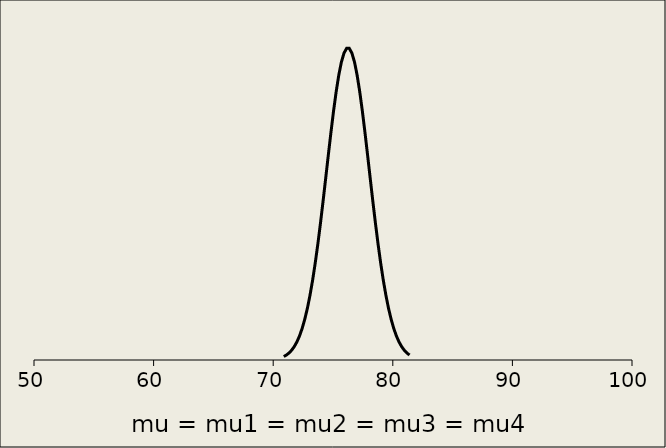
| Category | All conditions |
|---|---|
| 70.88343685400051 | 0.002 |
| 71.10248024771477 | 0.004 |
| 71.32152364142902 | 0.005 |
| 71.54056703514328 | 0.007 |
| 71.75961042885754 | 0.01 |
| 71.97865382257181 | 0.013 |
| 72.19769721628607 | 0.017 |
| 72.41674061000033 | 0.022 |
| 72.63578400371459 | 0.029 |
| 72.85482739742885 | 0.037 |
| 73.07387079114311 | 0.046 |
| 73.29291418485737 | 0.057 |
| 73.51195757857164 | 0.069 |
| 73.7310009722859 | 0.083 |
| 73.95004436600016 | 0.098 |
| 74.16908775971442 | 0.113 |
| 74.38813115342867 | 0.13 |
| 74.60717454714293 | 0.146 |
| 74.8262179408572 | 0.162 |
| 75.04526133457145 | 0.178 |
| 75.2643047282857 | 0.192 |
| 75.48334812199997 | 0.203 |
| 75.70239151571423 | 0.213 |
| 75.92143490942848 | 0.219 |
| 76.14047830314274 | 0.223 |
| 76.359521696857 | 0.223 |
| 76.57856509057126 | 0.219 |
| 76.7976084842855 | 0.213 |
| 77.01665187799978 | 0.203 |
| 77.23569527171404 | 0.192 |
| 77.4547386654283 | 0.178 |
| 77.67378205914255 | 0.162 |
| 77.89282545285681 | 0.146 |
| 78.11186884657107 | 0.13 |
| 78.33091224028533 | 0.113 |
| 78.54995563399957 | 0.098 |
| 78.76899902771385 | 0.083 |
| 78.9880424214281 | 0.069 |
| 79.20708581514236 | 0.057 |
| 79.42612920885662 | 0.046 |
| 79.64517260257088 | 0.037 |
| 79.86421599628513 | 0.029 |
| 80.0832593899994 | 0.022 |
| 80.30230278371366 | 0.017 |
| 80.52134617742792 | 0.013 |
| 80.74038957114217 | 0.01 |
| 80.95943296485643 | 0.007 |
| 81.17847635857069 | 0.005 |
| 81.39751975228495 | 0.004 |